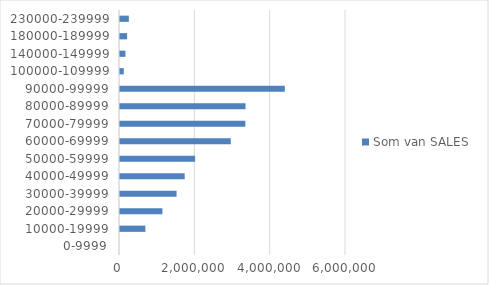
| Category | Totaal |
|---|---|
| 0-9999 | 0 |
| 10000-19999 | 673754 |
| 20000-29999 | 1126210 |
| 30000-39999 | 1501902 |
| 40000-49999 | 1717680 |
| 50000-59999 | 1993955 |
| 60000-69999 | 2941855 |
| 70000-79999 | 3326930 |
| 80000-89999 | 3332935 |
| 90000-99999 | 4375848 |
| 100000-109999 | 100000 |
| 140000-149999 | 144719 |
| 180000-189999 | 189438 |
| 230000-239999 | 234157 |